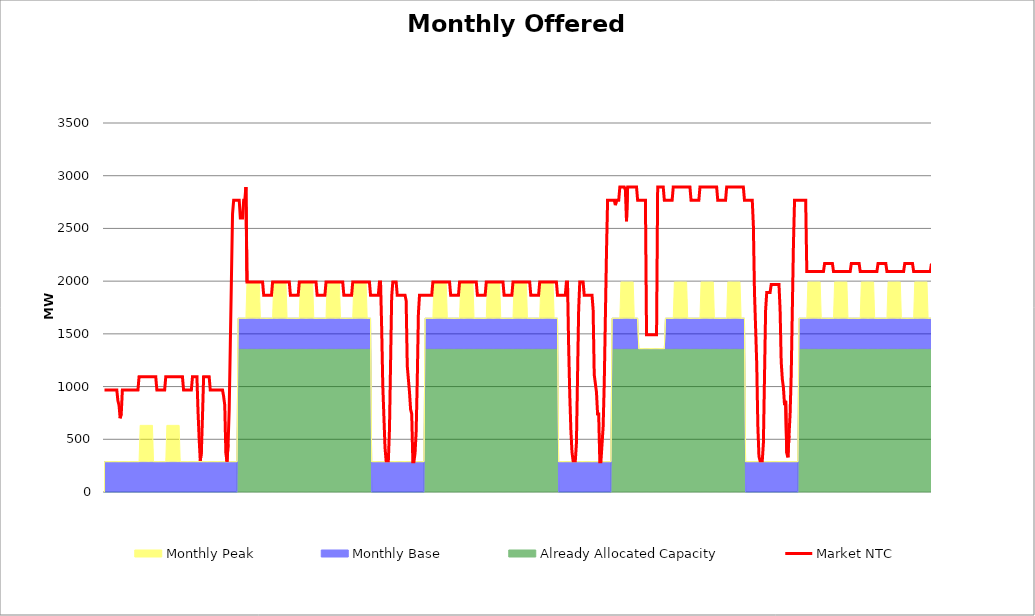
| Category | Market NTC |
|---|---|
| 0 | 967 |
| 1 | 967 |
| 2 | 967 |
| 3 | 967 |
| 4 | 967 |
| 5 | 967 |
| 6 | 967 |
| 7 | 967 |
| 8 | 967 |
| 9 | 967 |
| 10 | 967 |
| 11 | 967 |
| 12 | 865 |
| 13 | 824 |
| 14 | 700 |
| 15 | 741 |
| 16 | 967 |
| 17 | 967 |
| 18 | 967 |
| 19 | 967 |
| 20 | 967 |
| 21 | 967 |
| 22 | 967 |
| 23 | 967 |
| 24 | 967 |
| 25 | 967 |
| 26 | 967 |
| 27 | 967 |
| 28 | 967 |
| 29 | 967 |
| 30 | 967 |
| 31 | 1092 |
| 32 | 1092 |
| 33 | 1092 |
| 34 | 1092 |
| 35 | 1092 |
| 36 | 1092 |
| 37 | 1092 |
| 38 | 1092 |
| 39 | 1092 |
| 40 | 1092 |
| 41 | 1092 |
| 42 | 1092 |
| 43 | 1092 |
| 44 | 1092 |
| 45 | 1092 |
| 46 | 1092 |
| 47 | 967 |
| 48 | 967 |
| 49 | 967 |
| 50 | 967 |
| 51 | 967 |
| 52 | 967 |
| 53 | 967 |
| 54 | 967 |
| 55 | 1092 |
| 56 | 1092 |
| 57 | 1092 |
| 58 | 1092 |
| 59 | 1092 |
| 60 | 1092 |
| 61 | 1092 |
| 62 | 1092 |
| 63 | 1092 |
| 64 | 1092 |
| 65 | 1092 |
| 66 | 1092 |
| 67 | 1092 |
| 68 | 1092 |
| 69 | 1092 |
| 70 | 1092 |
| 71 | 967 |
| 72 | 967 |
| 73 | 967 |
| 74 | 967 |
| 75 | 967 |
| 76 | 967 |
| 77 | 967 |
| 78 | 967 |
| 79 | 1092 |
| 80 | 1092 |
| 81 | 1092 |
| 82 | 1092 |
| 83 | 1092 |
| 84 | 759 |
| 85 | 506 |
| 86 | 296 |
| 87 | 380 |
| 88 | 717 |
| 89 | 1092 |
| 90 | 1092 |
| 91 | 1092 |
| 92 | 1092 |
| 93 | 1092 |
| 94 | 1092 |
| 95 | 967 |
| 96 | 967 |
| 97 | 967 |
| 98 | 967 |
| 99 | 967 |
| 100 | 967 |
| 101 | 967 |
| 102 | 967 |
| 103 | 967 |
| 104 | 967 |
| 105 | 967 |
| 106 | 967 |
| 107 | 906 |
| 108 | 824 |
| 109 | 370 |
| 110 | 288 |
| 111 | 453 |
| 112 | 783 |
| 113 | 1401 |
| 114 | 2020 |
| 115 | 2639 |
| 116 | 2767 |
| 117 | 2767 |
| 118 | 2767 |
| 119 | 2767 |
| 120 | 2767 |
| 121 | 2767 |
| 122 | 2598 |
| 123 | 2598 |
| 124 | 2598 |
| 125 | 2767 |
| 126 | 2767 |
| 127 | 2892 |
| 128 | 1992 |
| 129 | 1992 |
| 130 | 1992 |
| 131 | 1992 |
| 132 | 1992 |
| 133 | 1992 |
| 134 | 1992 |
| 135 | 1992 |
| 136 | 1992 |
| 137 | 1992 |
| 138 | 1992 |
| 139 | 1992 |
| 140 | 1992 |
| 141 | 1992 |
| 142 | 1992 |
| 143 | 1867 |
| 144 | 1867 |
| 145 | 1867 |
| 146 | 1867 |
| 147 | 1867 |
| 148 | 1867 |
| 149 | 1867 |
| 150 | 1867 |
| 151 | 1992 |
| 152 | 1992 |
| 153 | 1992 |
| 154 | 1992 |
| 155 | 1992 |
| 156 | 1992 |
| 157 | 1992 |
| 158 | 1992 |
| 159 | 1992 |
| 160 | 1992 |
| 161 | 1992 |
| 162 | 1992 |
| 163 | 1992 |
| 164 | 1992 |
| 165 | 1992 |
| 166 | 1992 |
| 167 | 1867 |
| 168 | 1867 |
| 169 | 1867 |
| 170 | 1867 |
| 171 | 1867 |
| 172 | 1867 |
| 173 | 1867 |
| 174 | 1867 |
| 175 | 1992 |
| 176 | 1992 |
| 177 | 1992 |
| 178 | 1992 |
| 179 | 1992 |
| 180 | 1992 |
| 181 | 1992 |
| 182 | 1992 |
| 183 | 1992 |
| 184 | 1992 |
| 185 | 1992 |
| 186 | 1992 |
| 187 | 1992 |
| 188 | 1992 |
| 189 | 1992 |
| 190 | 1992 |
| 191 | 1867 |
| 192 | 1867 |
| 193 | 1867 |
| 194 | 1867 |
| 195 | 1867 |
| 196 | 1867 |
| 197 | 1867 |
| 198 | 1867 |
| 199 | 1992 |
| 200 | 1992 |
| 201 | 1992 |
| 202 | 1992 |
| 203 | 1992 |
| 204 | 1992 |
| 205 | 1992 |
| 206 | 1992 |
| 207 | 1992 |
| 208 | 1992 |
| 209 | 1992 |
| 210 | 1992 |
| 211 | 1992 |
| 212 | 1992 |
| 213 | 1992 |
| 214 | 1992 |
| 215 | 1867 |
| 216 | 1867 |
| 217 | 1867 |
| 218 | 1867 |
| 219 | 1867 |
| 220 | 1867 |
| 221 | 1867 |
| 222 | 1867 |
| 223 | 1992 |
| 224 | 1992 |
| 225 | 1992 |
| 226 | 1992 |
| 227 | 1992 |
| 228 | 1992 |
| 229 | 1992 |
| 230 | 1992 |
| 231 | 1992 |
| 232 | 1992 |
| 233 | 1992 |
| 234 | 1992 |
| 235 | 1992 |
| 236 | 1992 |
| 237 | 1992 |
| 238 | 1992 |
| 239 | 1867 |
| 240 | 1867 |
| 241 | 1867 |
| 242 | 1867 |
| 243 | 1867 |
| 244 | 1867 |
| 245 | 1867 |
| 246 | 1867 |
| 247 | 1992 |
| 248 | 1992 |
| 249 | 1558 |
| 250 | 1011 |
| 251 | 717 |
| 252 | 422 |
| 253 | 296 |
| 254 | 296 |
| 255 | 296 |
| 256 | 590 |
| 257 | 1221 |
| 258 | 1853 |
| 259 | 1992 |
| 260 | 1992 |
| 261 | 1992 |
| 262 | 1992 |
| 263 | 1867 |
| 264 | 1867 |
| 265 | 1867 |
| 266 | 1867 |
| 267 | 1867 |
| 268 | 1867 |
| 269 | 1867 |
| 270 | 1867 |
| 271 | 1814 |
| 272 | 1195 |
| 273 | 1071 |
| 274 | 948 |
| 275 | 783 |
| 276 | 741 |
| 277 | 288 |
| 278 | 288 |
| 279 | 370 |
| 280 | 576 |
| 281 | 1071 |
| 282 | 1690 |
| 283 | 1867 |
| 284 | 1867 |
| 285 | 1867 |
| 286 | 1867 |
| 287 | 1867 |
| 288 | 1867 |
| 289 | 1867 |
| 290 | 1867 |
| 291 | 1867 |
| 292 | 1867 |
| 293 | 1867 |
| 294 | 1867 |
| 295 | 1992 |
| 296 | 1992 |
| 297 | 1992 |
| 298 | 1992 |
| 299 | 1992 |
| 300 | 1992 |
| 301 | 1992 |
| 302 | 1992 |
| 303 | 1992 |
| 304 | 1992 |
| 305 | 1992 |
| 306 | 1992 |
| 307 | 1992 |
| 308 | 1992 |
| 309 | 1992 |
| 310 | 1992 |
| 311 | 1867 |
| 312 | 1867 |
| 313 | 1867 |
| 314 | 1867 |
| 315 | 1867 |
| 316 | 1867 |
| 317 | 1867 |
| 318 | 1867 |
| 319 | 1992 |
| 320 | 1992 |
| 321 | 1992 |
| 322 | 1992 |
| 323 | 1992 |
| 324 | 1992 |
| 325 | 1992 |
| 326 | 1992 |
| 327 | 1992 |
| 328 | 1992 |
| 329 | 1992 |
| 330 | 1992 |
| 331 | 1992 |
| 332 | 1992 |
| 333 | 1992 |
| 334 | 1992 |
| 335 | 1867 |
| 336 | 1867 |
| 337 | 1867 |
| 338 | 1867 |
| 339 | 1867 |
| 340 | 1867 |
| 341 | 1867 |
| 342 | 1867 |
| 343 | 1992 |
| 344 | 1992 |
| 345 | 1992 |
| 346 | 1992 |
| 347 | 1992 |
| 348 | 1992 |
| 349 | 1992 |
| 350 | 1992 |
| 351 | 1992 |
| 352 | 1992 |
| 353 | 1992 |
| 354 | 1992 |
| 355 | 1992 |
| 356 | 1992 |
| 357 | 1992 |
| 358 | 1992 |
| 359 | 1867 |
| 360 | 1867 |
| 361 | 1867 |
| 362 | 1867 |
| 363 | 1867 |
| 364 | 1867 |
| 365 | 1867 |
| 366 | 1867 |
| 367 | 1992 |
| 368 | 1992 |
| 369 | 1992 |
| 370 | 1992 |
| 371 | 1992 |
| 372 | 1992 |
| 373 | 1992 |
| 374 | 1992 |
| 375 | 1992 |
| 376 | 1992 |
| 377 | 1992 |
| 378 | 1992 |
| 379 | 1992 |
| 380 | 1992 |
| 381 | 1992 |
| 382 | 1992 |
| 383 | 1867 |
| 384 | 1867 |
| 385 | 1867 |
| 386 | 1867 |
| 387 | 1867 |
| 388 | 1867 |
| 389 | 1867 |
| 390 | 1867 |
| 391 | 1992 |
| 392 | 1992 |
| 393 | 1992 |
| 394 | 1992 |
| 395 | 1992 |
| 396 | 1992 |
| 397 | 1992 |
| 398 | 1992 |
| 399 | 1992 |
| 400 | 1992 |
| 401 | 1992 |
| 402 | 1992 |
| 403 | 1992 |
| 404 | 1992 |
| 405 | 1992 |
| 406 | 1992 |
| 407 | 1867 |
| 408 | 1867 |
| 409 | 1867 |
| 410 | 1867 |
| 411 | 1867 |
| 412 | 1867 |
| 413 | 1867 |
| 414 | 1867 |
| 415 | 1992 |
| 416 | 1992 |
| 417 | 1390 |
| 418 | 927 |
| 419 | 590 |
| 420 | 380 |
| 421 | 296 |
| 422 | 296 |
| 423 | 296 |
| 424 | 464 |
| 425 | 1095 |
| 426 | 1726 |
| 427 | 1992 |
| 428 | 1992 |
| 429 | 1992 |
| 430 | 1992 |
| 431 | 1867 |
| 432 | 1867 |
| 433 | 1867 |
| 434 | 1867 |
| 435 | 1867 |
| 436 | 1867 |
| 437 | 1867 |
| 438 | 1867 |
| 439 | 1731 |
| 440 | 1113 |
| 441 | 1030 |
| 442 | 948 |
| 443 | 741 |
| 444 | 741 |
| 445 | 288 |
| 446 | 288 |
| 447 | 453 |
| 448 | 618 |
| 449 | 1030 |
| 450 | 1649 |
| 451 | 2268 |
| 452 | 2767 |
| 453 | 2767 |
| 454 | 2767 |
| 455 | 2767 |
| 456 | 2767 |
| 457 | 2767 |
| 458 | 2767 |
| 459 | 2721 |
| 460 | 2767 |
| 461 | 2767 |
| 462 | 2767 |
| 463 | 2892 |
| 464 | 2892 |
| 465 | 2892 |
| 466 | 2892 |
| 467 | 2892 |
| 468 | 2863 |
| 469 | 2568 |
| 470 | 2892 |
| 471 | 2892 |
| 472 | 2892 |
| 473 | 2892 |
| 474 | 2892 |
| 475 | 2892 |
| 476 | 2892 |
| 477 | 2892 |
| 478 | 2892 |
| 479 | 2767 |
| 480 | 2767 |
| 481 | 2767 |
| 482 | 2767 |
| 483 | 2767 |
| 484 | 2767 |
| 485 | 2767 |
| 486 | 2767 |
| 487 | 1492 |
| 488 | 1492 |
| 489 | 1492 |
| 490 | 1492 |
| 491 | 1492 |
| 492 | 1492 |
| 493 | 1492 |
| 494 | 1492 |
| 495 | 1492 |
| 496 | 1492 |
| 497 | 2892 |
| 498 | 2892 |
| 499 | 2892 |
| 500 | 2892 |
| 501 | 2892 |
| 502 | 2892 |
| 503 | 2767 |
| 504 | 2767 |
| 505 | 2767 |
| 506 | 2767 |
| 507 | 2767 |
| 508 | 2767 |
| 509 | 2767 |
| 510 | 2767 |
| 511 | 2892 |
| 512 | 2892 |
| 513 | 2892 |
| 514 | 2892 |
| 515 | 2892 |
| 516 | 2892 |
| 517 | 2892 |
| 518 | 2892 |
| 519 | 2892 |
| 520 | 2892 |
| 521 | 2892 |
| 522 | 2892 |
| 523 | 2892 |
| 524 | 2892 |
| 525 | 2892 |
| 526 | 2892 |
| 527 | 2767 |
| 528 | 2767 |
| 529 | 2767 |
| 530 | 2767 |
| 531 | 2767 |
| 532 | 2767 |
| 533 | 2767 |
| 534 | 2767 |
| 535 | 2892 |
| 536 | 2892 |
| 537 | 2892 |
| 538 | 2892 |
| 539 | 2892 |
| 540 | 2892 |
| 541 | 2892 |
| 542 | 2892 |
| 543 | 2892 |
| 544 | 2892 |
| 545 | 2892 |
| 546 | 2892 |
| 547 | 2892 |
| 548 | 2892 |
| 549 | 2892 |
| 550 | 2892 |
| 551 | 2767 |
| 552 | 2767 |
| 553 | 2767 |
| 554 | 2767 |
| 555 | 2767 |
| 556 | 2767 |
| 557 | 2767 |
| 558 | 2767 |
| 559 | 2892 |
| 560 | 2892 |
| 561 | 2892 |
| 562 | 2892 |
| 563 | 2892 |
| 564 | 2892 |
| 565 | 2892 |
| 566 | 2892 |
| 567 | 2892 |
| 568 | 2892 |
| 569 | 2892 |
| 570 | 2892 |
| 571 | 2892 |
| 572 | 2892 |
| 573 | 2892 |
| 574 | 2892 |
| 575 | 2767 |
| 576 | 2767 |
| 577 | 2767 |
| 578 | 2767 |
| 579 | 2767 |
| 580 | 2767 |
| 581 | 2767 |
| 582 | 2767 |
| 583 | 2526 |
| 584 | 1892 |
| 585 | 1558 |
| 586 | 1221 |
| 587 | 632 |
| 588 | 338 |
| 589 | 296 |
| 590 | 296 |
| 591 | 296 |
| 592 | 464 |
| 593 | 1095 |
| 594 | 1726 |
| 595 | 1892 |
| 596 | 1892 |
| 597 | 1892 |
| 598 | 1892 |
| 599 | 1967 |
| 600 | 1967 |
| 601 | 1967 |
| 602 | 1967 |
| 603 | 1967 |
| 604 | 1967 |
| 605 | 1967 |
| 606 | 1967 |
| 607 | 1731 |
| 608 | 1236 |
| 609 | 1071 |
| 610 | 989 |
| 611 | 824 |
| 612 | 865 |
| 613 | 370 |
| 614 | 329 |
| 615 | 535 |
| 616 | 741 |
| 617 | 1113 |
| 618 | 1731 |
| 619 | 2350 |
| 620 | 2767 |
| 621 | 2767 |
| 622 | 2767 |
| 623 | 2767 |
| 624 | 2767 |
| 625 | 2767 |
| 626 | 2767 |
| 627 | 2767 |
| 628 | 2767 |
| 629 | 2767 |
| 630 | 2767 |
| 631 | 2092 |
| 632 | 2092 |
| 633 | 2092 |
| 634 | 2092 |
| 635 | 2092 |
| 636 | 2092 |
| 637 | 2092 |
| 638 | 2092 |
| 639 | 2092 |
| 640 | 2092 |
| 641 | 2092 |
| 642 | 2092 |
| 643 | 2092 |
| 644 | 2092 |
| 645 | 2092 |
| 646 | 2092 |
| 647 | 2167 |
| 648 | 2167 |
| 649 | 2167 |
| 650 | 2167 |
| 651 | 2167 |
| 652 | 2167 |
| 653 | 2167 |
| 654 | 2167 |
| 655 | 2092 |
| 656 | 2092 |
| 657 | 2092 |
| 658 | 2092 |
| 659 | 2092 |
| 660 | 2092 |
| 661 | 2092 |
| 662 | 2092 |
| 663 | 2092 |
| 664 | 2092 |
| 665 | 2092 |
| 666 | 2092 |
| 667 | 2092 |
| 668 | 2092 |
| 669 | 2092 |
| 670 | 2092 |
| 671 | 2167 |
| 672 | 2167 |
| 673 | 2167 |
| 674 | 2167 |
| 675 | 2167 |
| 676 | 2167 |
| 677 | 2167 |
| 678 | 2167 |
| 679 | 2092 |
| 680 | 2092 |
| 681 | 2092 |
| 682 | 2092 |
| 683 | 2092 |
| 684 | 2092 |
| 685 | 2092 |
| 686 | 2092 |
| 687 | 2092 |
| 688 | 2092 |
| 689 | 2092 |
| 690 | 2092 |
| 691 | 2092 |
| 692 | 2092 |
| 693 | 2092 |
| 694 | 2092 |
| 695 | 2167 |
| 696 | 2167 |
| 697 | 2167 |
| 698 | 2167 |
| 699 | 2167 |
| 700 | 2167 |
| 701 | 2167 |
| 702 | 2167 |
| 703 | 2092 |
| 704 | 2092 |
| 705 | 2092 |
| 706 | 2092 |
| 707 | 2092 |
| 708 | 2092 |
| 709 | 2092 |
| 710 | 2092 |
| 711 | 2092 |
| 712 | 2092 |
| 713 | 2092 |
| 714 | 2092 |
| 715 | 2092 |
| 716 | 2092 |
| 717 | 2092 |
| 718 | 2092 |
| 719 | 2167 |
| 720 | 2167 |
| 721 | 2167 |
| 722 | 2167 |
| 723 | 2167 |
| 724 | 2167 |
| 725 | 2167 |
| 726 | 2167 |
| 727 | 2092 |
| 728 | 2092 |
| 729 | 2092 |
| 730 | 2092 |
| 731 | 2092 |
| 732 | 2092 |
| 733 | 2092 |
| 734 | 2092 |
| 735 | 2092 |
| 736 | 2092 |
| 737 | 2092 |
| 738 | 2092 |
| 739 | 2092 |
| 740 | 2092 |
| 741 | 2092 |
| 742 | 2092 |
| 743 | 2167 |